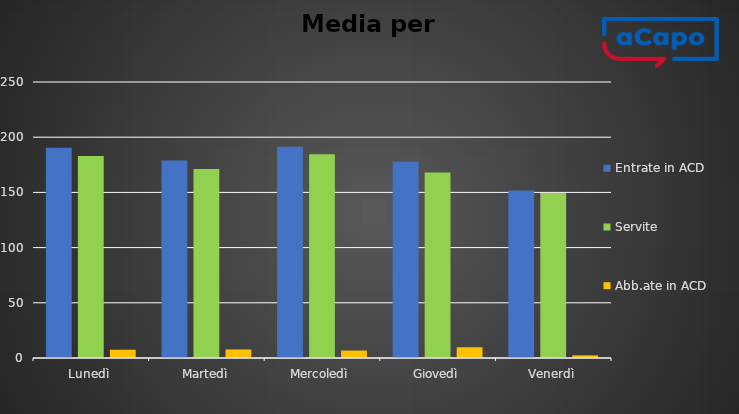
| Category | Entrate in ACD | Servite | Abb.ate in ACD |
|---|---|---|---|
| Lunedì | 190.5 | 183 | 7.5 |
| Martedì | 179 | 171.25 | 7.75 |
| Mercoledì | 191.25 | 184.5 | 6.75 |
| Giovedì | 177.75 | 168 | 9.75 |
| Venerdì | 151.8 | 149.4 | 2.4 |